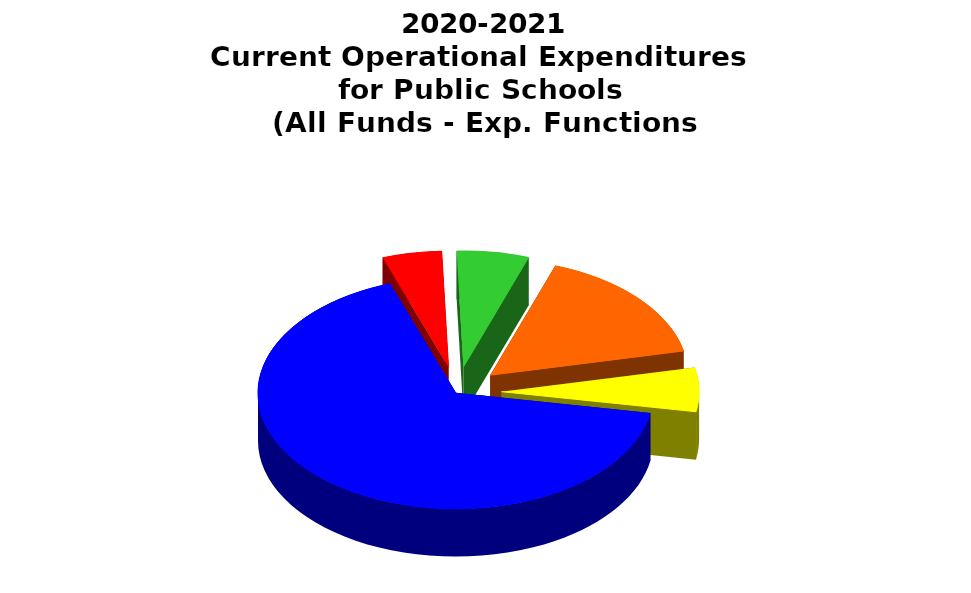
| Category | Series 0 |
|---|---|
| Instruction | 0.668 |
| General Administration | 0.048 |
| School Administration | 0.059 |
| Other-Instructional Support | 0.163 |
| Non-Instructional Support | 0.061 |